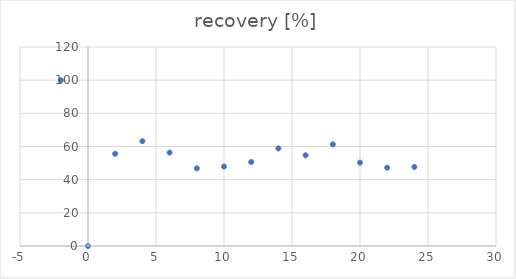
| Category | recovery [%] |
|---|---|
| -2.0 | 100 |
| 0.0 | 0 |
| 2.0 | 55.616 |
| 4.0 | 63.226 |
| 6.0 | 56.321 |
| 8.0 | 46.786 |
| 10.0 | 47.928 |
| 12.0 | 50.652 |
| 14.0 | 58.852 |
| 16.0 | 54.687 |
| 18.0 | 61.277 |
| 20.0 | 50.259 |
| 22.0 | 47.234 |
| 24.0 | 47.718 |